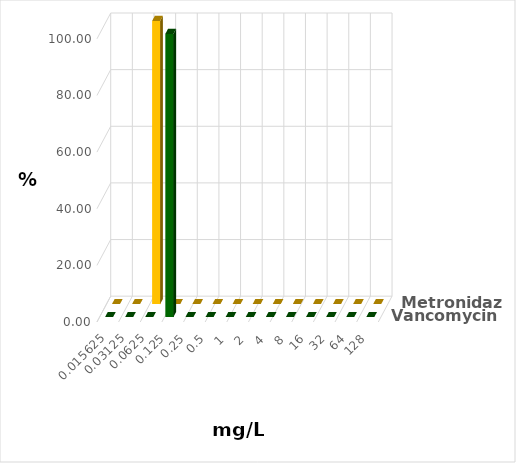
| Category | Vancomycin | Metronidazol |
|---|---|---|
| 0.015625 | 0 | 0 |
| 0.03125 | 0 | 0 |
| 0.0625 | 0 | 100 |
| 0.125 | 100 | 0 |
| 0.25 | 0 | 0 |
| 0.5 | 0 | 0 |
| 1.0 | 0 | 0 |
| 2.0 | 0 | 0 |
| 4.0 | 0 | 0 |
| 8.0 | 0 | 0 |
| 16.0 | 0 | 0 |
| 32.0 | 0 | 0 |
| 64.0 | 0 | 0 |
| 128.0 | 0 | 0 |